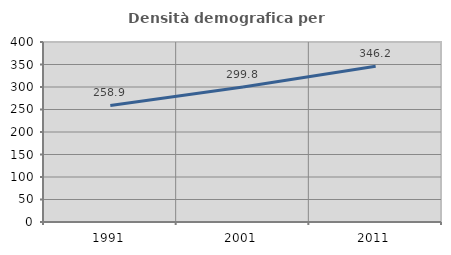
| Category | Densità demografica |
|---|---|
| 1991.0 | 258.94 |
| 2001.0 | 299.79 |
| 2011.0 | 346.221 |